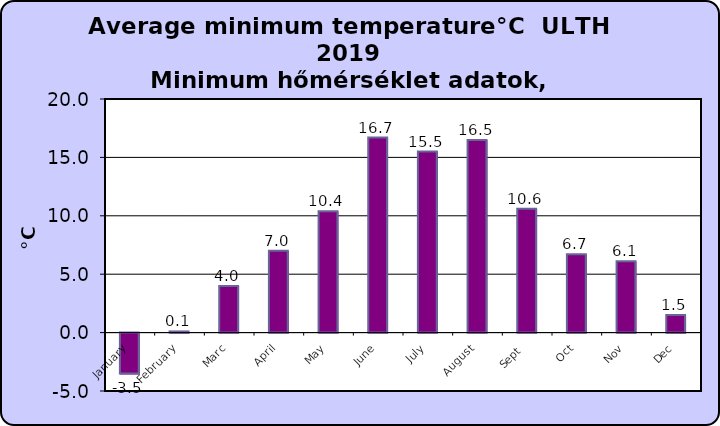
| Category | Series 0 |
|---|---|
| January | -3.5 |
| February | 0.1 |
| Marc | 4 |
| April | 7 |
| May | 10.4 |
| June | 16.7 |
| July | 15.5 |
| August | 16.5 |
| Sept  | 10.6 |
| Oct | 6.7 |
| Nov | 6.1 |
| Dec | 1.5 |